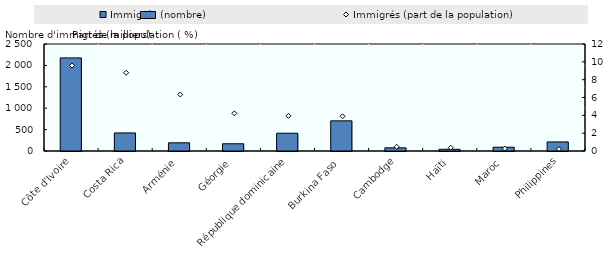
| Category | Immigrés (nombre) |
|---|---|
| Côte d’Ivoire | 2175.399 |
| Costa Rica | 421.697 |
| Arménie | 191.199 |
| Géorgie | 168.802 |
| République dominicaine | 415.564 |
| Burkina Faso | 704.676 |
| Cambodge | 73.963 |
| Haïti | 39.529 |
| Maroc | 88.511 |
| Philippines | 211.862 |